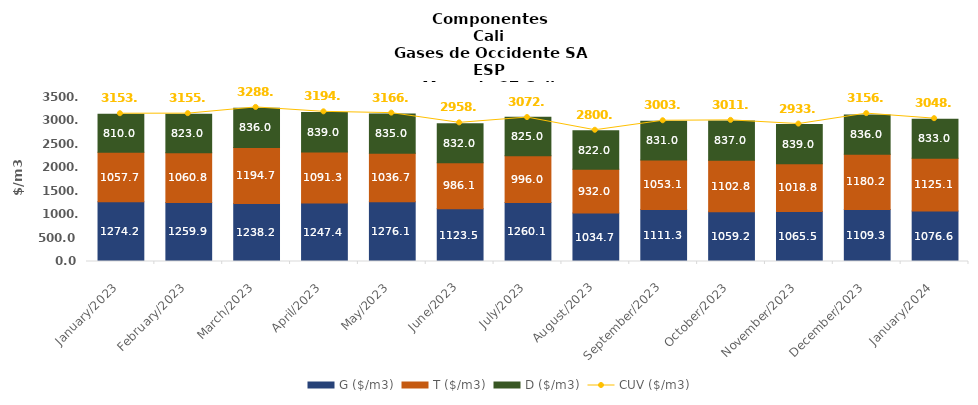
| Category | G ($/m3) | T ($/m3) | D ($/m3) |
|---|---|---|---|
| 2023-01-01 | 1274.19 | 1057.73 | 810 |
| 2023-02-01 | 1259.91 | 1060.8 | 823 |
| 2023-03-01 | 1238.18 | 1194.68 | 836 |
| 2023-04-01 | 1247.38 | 1091.29 | 839 |
| 2023-05-01 | 1276.06 | 1036.67 | 835 |
| 2023-06-01 | 1123.54 | 986.08 | 832 |
| 2023-07-01 | 1260.12 | 995.95 | 825 |
| 2023-08-01 | 1034.65 | 931.99 | 822 |
| 2023-09-01 | 1111.32 | 1053.08 | 831 |
| 2023-10-01 | 1059.24 | 1102.78 | 837 |
| 2023-11-01 | 1065.48 | 1018.81 | 839 |
| 2023-12-01 | 1109.29 | 1180.21 | 836 |
| 2024-01-01 | 1076.64 | 1125.08 | 833 |